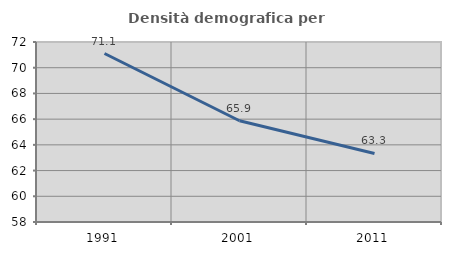
| Category | Densità demografica |
|---|---|
| 1991.0 | 71.103 |
| 2001.0 | 65.873 |
| 2011.0 | 63.333 |